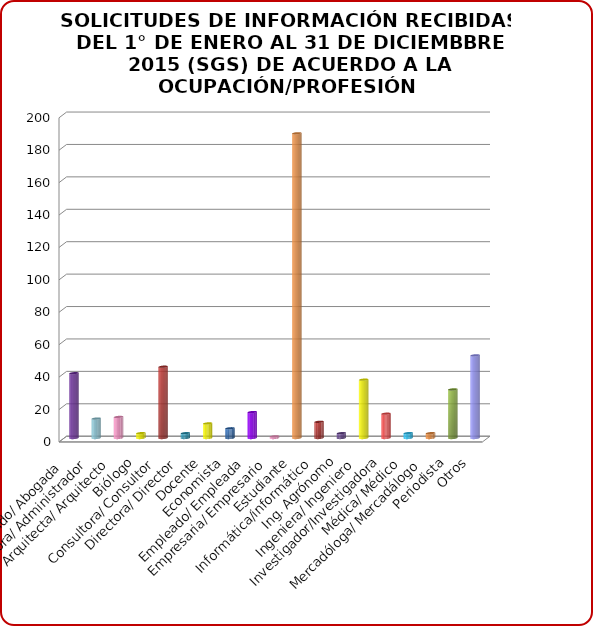
| Category | Series 0 |
|---|---|
| Abogado/ Abogada  | 40 |
| Administradora/ Administrador | 12 |
| Arquitecta/ Arquitecto | 13 |
| Biólogo | 3 |
| Consultora/ Consultor | 44 |
| Directora/ Director | 3 |
| Docente | 9 |
| Economista | 6 |
| Empleado/ Empleada | 16 |
| Empresaria/ Empresario | 1 |
| Estudiante | 188 |
| Informática/informático | 10 |
| Ing. Agrónomo | 3 |
| Ingeniera/ Ingeniero | 36 |
| Investigador/Investigadora | 15 |
| Médica/ Médico | 3 |
| Mercadóloga/ Mercadálogo | 3 |
| Periodista | 30 |
| Otros | 51 |